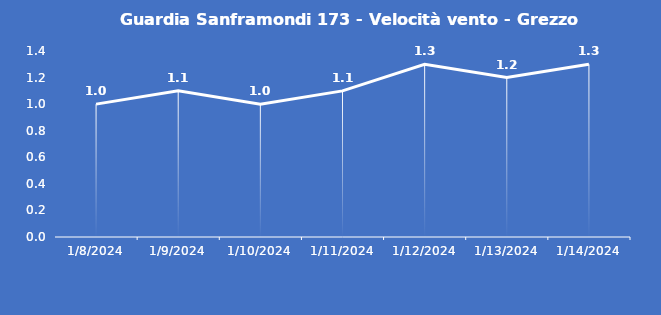
| Category | Guardia Sanframondi 173 - Velocità vento - Grezzo (m/s) |
|---|---|
| 1/8/24 | 1 |
| 1/9/24 | 1.1 |
| 1/10/24 | 1 |
| 1/11/24 | 1.1 |
| 1/12/24 | 1.3 |
| 1/13/24 | 1.2 |
| 1/14/24 | 1.3 |